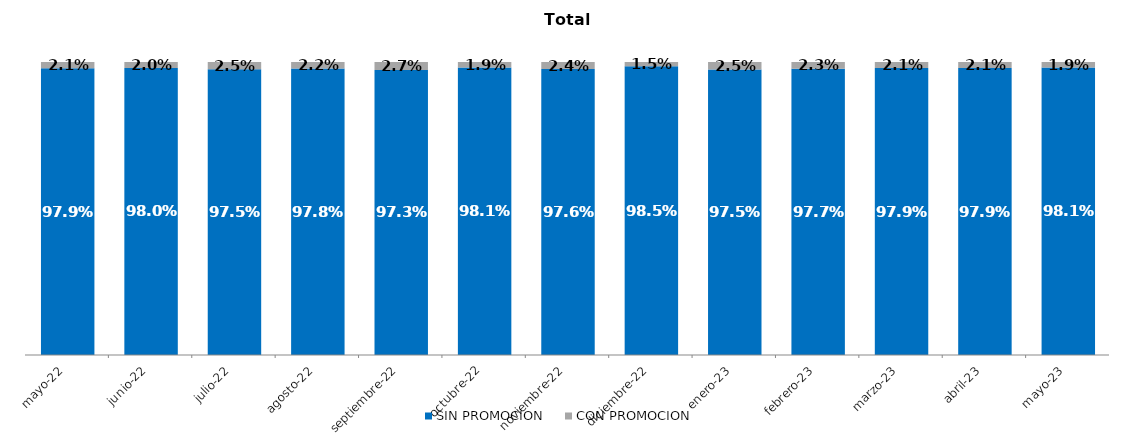
| Category | SIN PROMOCION   | CON PROMOCION   |
|---|---|---|
| 2022-05-01 | 0.979 | 0.021 |
| 2022-06-01 | 0.98 | 0.02 |
| 2022-07-01 | 0.975 | 0.025 |
| 2022-08-01 | 0.978 | 0.022 |
| 2022-09-01 | 0.973 | 0.027 |
| 2022-10-01 | 0.981 | 0.019 |
| 2022-11-01 | 0.976 | 0.024 |
| 2022-12-01 | 0.985 | 0.015 |
| 2023-01-01 | 0.975 | 0.025 |
| 2023-02-01 | 0.977 | 0.023 |
| 2023-03-01 | 0.979 | 0.021 |
| 2023-04-01 | 0.979 | 0.021 |
| 2023-05-01 | 0.981 | 0.019 |